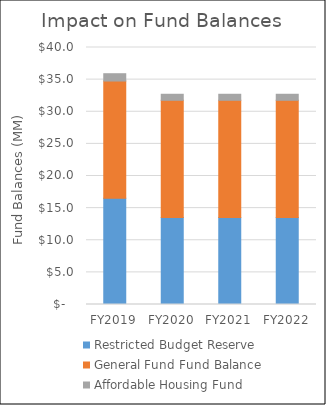
| Category | Restricted Budget Reserve | General Fund Fund Balance | Affordable Housing Fund |
|---|---|---|---|
| FY2019 | 16.55 | 18.23 | 1.14 |
| FY2020 | 13.55 | 18.23 | 0.94 |
| FY2021 | 13.55 | 18.23 | 0.94 |
| FY2022 | 13.55 | 18.23 | 0.94 |